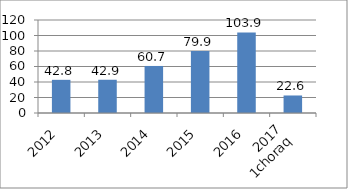
| Category | Series 0 |
|---|---|
| 2012 | 42.8 |
| 2013 | 42.9 |
| 2014 | 60.7 |
| 2015 | 79.9 |
| 2016 | 103.9 |
| 2017
1choraq | 22.6 |